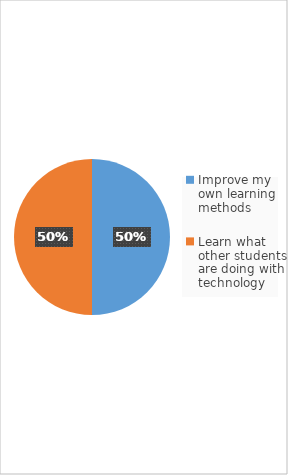
| Category | Series 0 |
|---|---|
| Improve my own learning methods | 3 |
| Learn what other students are doing with technology | 3 |